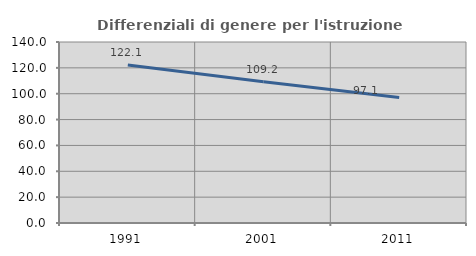
| Category | Differenziali di genere per l'istruzione superiore |
|---|---|
| 1991.0 | 122.127 |
| 2001.0 | 109.183 |
| 2011.0 | 97.067 |